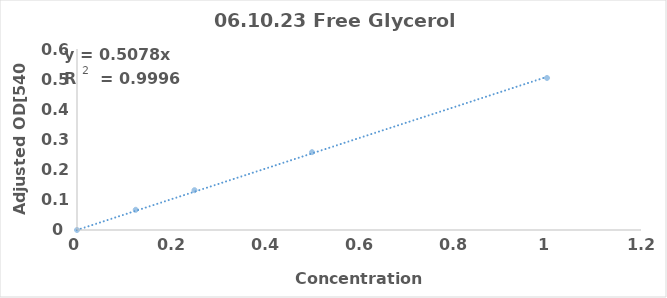
| Category | Series 0 |
|---|---|
| 0.0 | 0 |
| 0.125 | 0.067 |
| 0.25 | 0.132 |
| 0.5 | 0.258 |
| 1.0 | 0.504 |